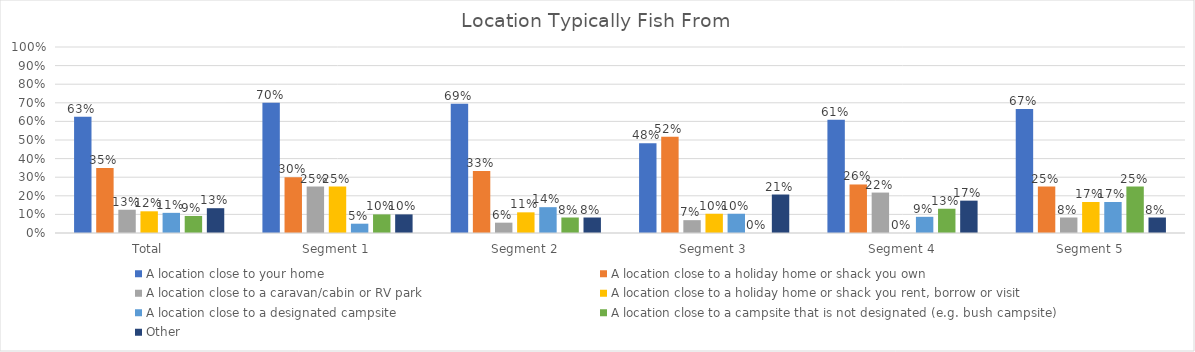
| Category | A location close to your home | A location close to a holiday home or shack you own | A location close to a caravan/cabin or RV park | A location close to a holiday home or shack you rent, borrow or visit | A location close to a designated campsite | A location close to a campsite that is not designated (e.g. bush campsite) | Other |
|---|---|---|---|---|---|---|---|
| Total | 0.625 | 0.35 | 0.125 | 0.117 | 0.108 | 0.092 | 0.133 |
| Segment 1 | 0.7 | 0.3 | 0.25 | 0.25 | 0.05 | 0.1 | 0.1 |
| Segment 2 | 0.694 | 0.333 | 0.056 | 0.111 | 0.139 | 0.083 | 0.083 |
| Segment 3 | 0.483 | 0.517 | 0.069 | 0.103 | 0.103 | 0 | 0.207 |
| Segment 4 | 0.609 | 0.261 | 0.217 | 0 | 0.087 | 0.13 | 0.174 |
| Segment 5 | 0.667 | 0.25 | 0.083 | 0.167 | 0.167 | 0.25 | 0.083 |